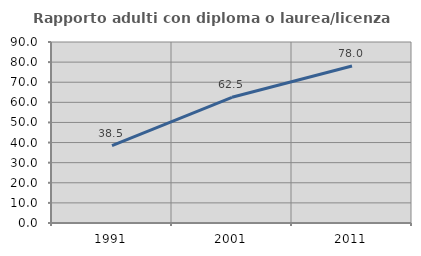
| Category | Rapporto adulti con diploma o laurea/licenza media  |
|---|---|
| 1991.0 | 38.462 |
| 2001.0 | 62.5 |
| 2011.0 | 78.049 |